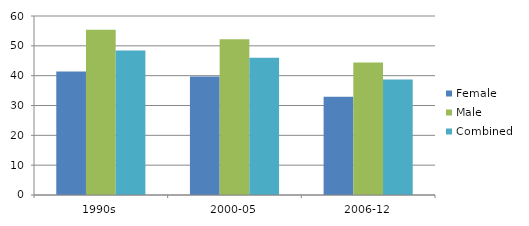
| Category | Female | Male | Combined |
|---|---|---|---|
| 1990s | 41.4 | 55.4 | 48.4 |
| 2000-05 | 39.7 | 52.2 | 46 |
| 2006-12 | 32.9 | 44.4 | 38.7 |